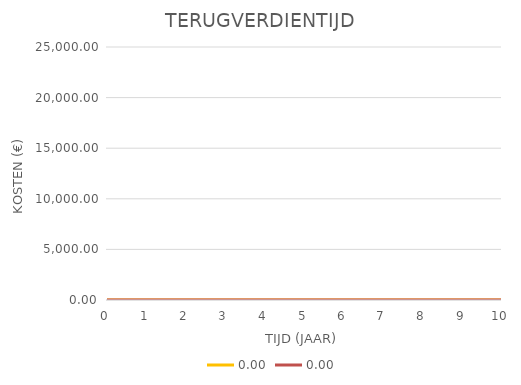
| Category | 0,00 |
|---|---|
| 0.0 | 0 |
| 1.0 | 0 |
| 2.0 | 0 |
| 3.0 | 0 |
| 4.0 | 0 |
| 5.0 | 0 |
| 6.0 | 0 |
| 7.0 | 0 |
| 8.0 | 0 |
| 9.0 | 0 |
| 10.0 | 0 |